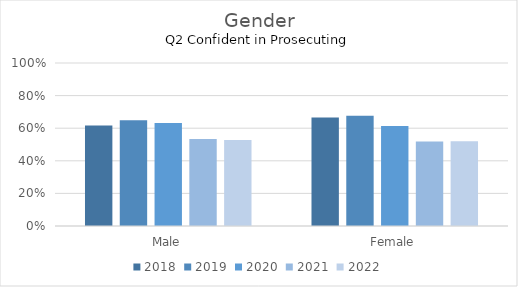
| Category | 2018 | 2019 | 2020 | 2021 | 2022 |
|---|---|---|---|---|---|
| Male | 0.617 | 0.649 | 0.632 | 0.533 | 0.527 |
| Female | 0.665 | 0.676 | 0.613 | 0.519 | 0.52 |